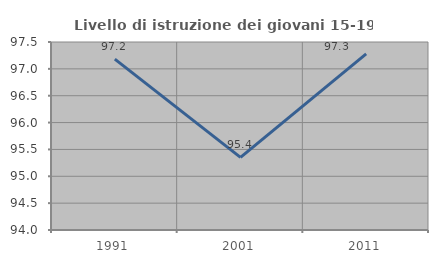
| Category | Livello di istruzione dei giovani 15-19 anni |
|---|---|
| 1991.0 | 97.18 |
| 2001.0 | 95.352 |
| 2011.0 | 97.279 |